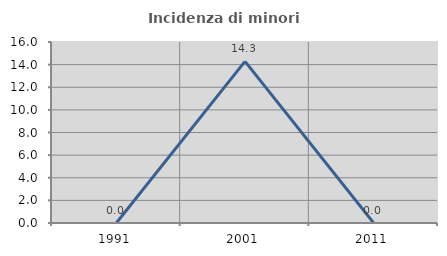
| Category | Incidenza di minori stranieri |
|---|---|
| 1991.0 | 0 |
| 2001.0 | 14.286 |
| 2011.0 | 0 |